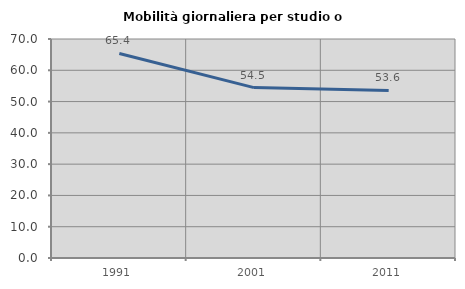
| Category | Mobilità giornaliera per studio o lavoro |
|---|---|
| 1991.0 | 65.385 |
| 2001.0 | 54.472 |
| 2011.0 | 53.575 |